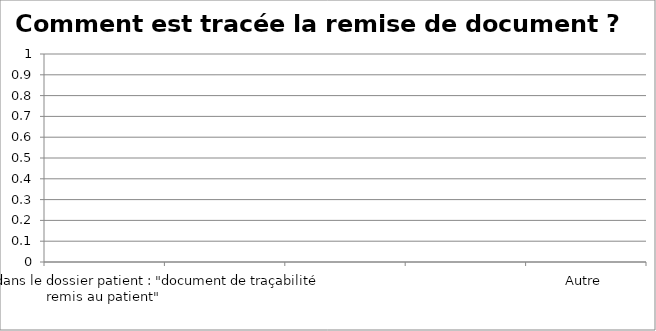
| Category | Comment est tracée la remise de document ? |
|---|---|
| Traçabilité écrite dans le dossier patient : "document de traçabilité remis au patient" | 0 |
| Accusé réception avec signature du patient du document de traçabilité | 0 |
| Photocopie ou édition en double du document fourni archivée dans le dossier patient avec date et nom de la personne ayant remis le document | 0 |
| Check list dans le dossier patient | 0 |
| Autre | 0 |